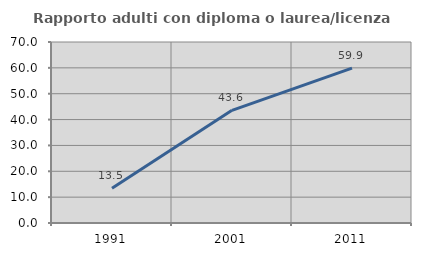
| Category | Rapporto adulti con diploma o laurea/licenza media  |
|---|---|
| 1991.0 | 13.477 |
| 2001.0 | 43.571 |
| 2011.0 | 59.902 |